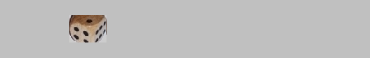
| Category | 1 | 2 | 3 | 4 | 5 | 6 |
|---|---|---|---|---|---|---|
|  | 0 | 0 | 0 | 0 | 0 | 0 |
| 2 | 0 | 1 | 0 | 0 | 0 | 0 |